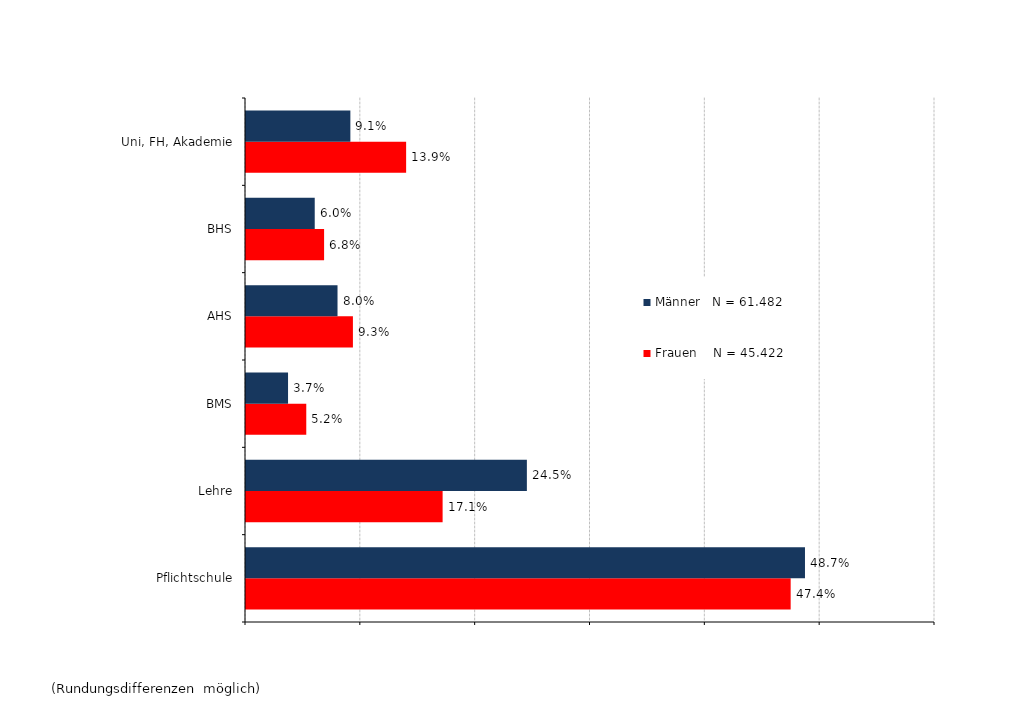
| Category | Frauen    N = 45.422 | Männer   N = 61.482 |
|---|---|---|
| Pflichtschule | 0.474 | 0.487 |
| Lehre | 0.171 | 0.245 |
| BMS | 0.052 | 0.037 |
| AHS | 0.093 | 0.08 |
| BHS | 0.068 | 0.06 |
| Uni, FH, Akademie | 0.139 | 0.091 |